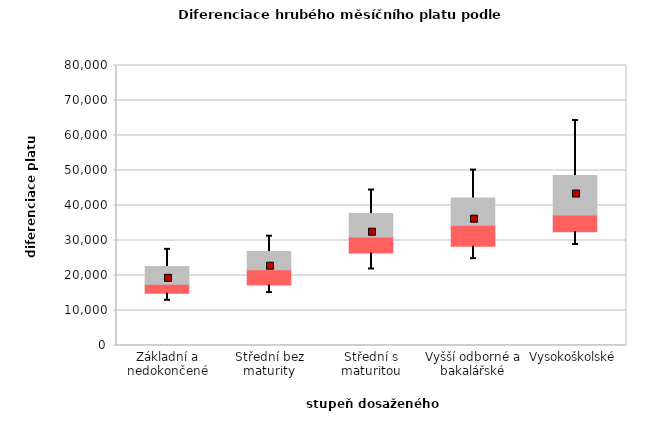
| Category | 0,25 | 0,5 | 0,75 |
|---|---|---|---|
| Základní a nedokončené | 14930.682 | 2597.842 | 5062.863 |
| Střední bez maturity | 17313.641 | 4355.05 | 5172.06 |
| Střední s maturitou | 26439.094 | 4561.081 | 6699.339 |
| Vyšší odborné a bakalářské | 28377.206 | 5970.164 | 7826.968 |
| Vysokoškolské | 32490.73 | 4815.157 | 11278.084 |